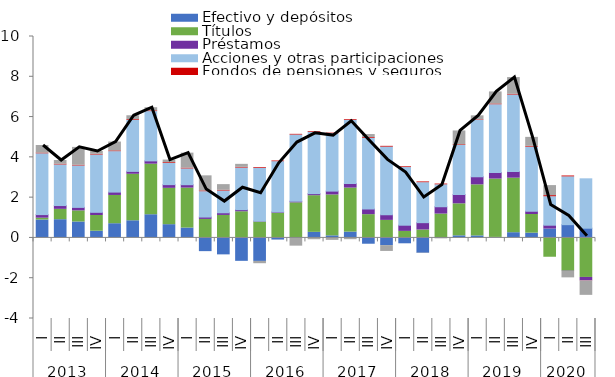
| Category | Efectivo y depósitos | Títulos | Préstamos  | Acciones y otras participaciones  | Fondos de pensiones y seguros | Otras cuentas |
|---|---|---|---|---|---|---|
| 0 | 0.891 | 0.089 | 0.177 | 3.02 | 0.035 | 0.377 |
| 1 | 0.905 | 0.514 | 0.188 | 2.017 | 0.035 | 0.185 |
| 2 | 0.791 | 0.551 | 0.174 | 2.058 | 0.035 | 0.885 |
| 3 | 0.333 | 0.78 | 0.158 | 2.846 | 0.035 | 0.14 |
| 4 | 0.706 | 1.403 | 0.167 | 2.008 | 0.036 | 0.441 |
| 5 | 0.851 | 2.309 | 0.142 | 2.537 | 0.036 | 0.19 |
| 6 | 1.151 | 2.51 | 0.162 | 2.447 | 0.037 | 0.157 |
| 7 | 0.658 | 1.804 | 0.183 | 1.055 | 0.038 | 0.127 |
| 8 | 0.49 | 1.984 | 0.168 | 0.785 | 0.038 | 0.745 |
| 9 | -0.681 | 0.919 | 0.117 | 1.259 | 0.037 | 0.75 |
| 10 | -0.841 | 1.117 | 0.131 | 1.082 | 0.036 | 0.281 |
| 11 | -1.162 | 1.299 | 0.103 | 2.068 | 0.035 | 0.148 |
| 12 | -1.166 | 0.793 | 0.044 | 2.625 | 0.034 | -0.114 |
| 13 | -0.105 | 1.225 | 0.065 | 2.495 | 0.034 | -0.007 |
| 14 | -0.02 | 1.741 | 0.08 | 3.288 | 0.033 | -0.388 |
| 15 | 0.277 | 1.819 | 0.102 | 3.05 | 0.033 | -0.09 |
| 16 | 0.103 | 2.03 | 0.19 | 2.847 | 0.032 | -0.122 |
| 17 | 0.289 | 2.185 | 0.223 | 3.144 | 0.034 | -0.088 |
| 18 | -0.313 | 1.155 | 0.281 | 3.513 | 0.036 | 0.149 |
| 19 | -0.381 | 0.871 | 0.28 | 3.359 | 0.037 | -0.29 |
| 20 | -0.291 | 0.325 | 0.307 | 2.863 | 0.036 | 0.004 |
| 21 | -0.761 | 0.394 | 0.364 | 1.985 | 0.037 | -0.013 |
| 22 | -0.024 | 1.184 | 0.365 | 1.089 | 0.037 | -0.022 |
| 23 | 0.105 | 1.588 | 0.464 | 2.431 | 0.035 | 0.688 |
| 24 | 0.1 | 2.535 | 0.401 | 2.813 | 0.023 | 0.189 |
| 25 | 0.026 | 2.896 | 0.328 | 3.363 | 0.036 | 0.6 |
| 26 | 0.26 | 2.707 | 0.333 | 3.795 | 0.038 | 0.829 |
| 27 | 0.238 | 0.926 | 0.164 | 3.18 | 0.04 | 0.445 |
| 28 | 0.442 | -0.959 | 0.19 | 1.413 | 0.055 | 0.499 |
| 29 | 0.658 | -1.651 | -0.015 | 2.373 | 0.043 | -0.317 |
| 30 | 0.483 | -1.961 | -0.172 | 2.451 | -0.009 | -0.709 |